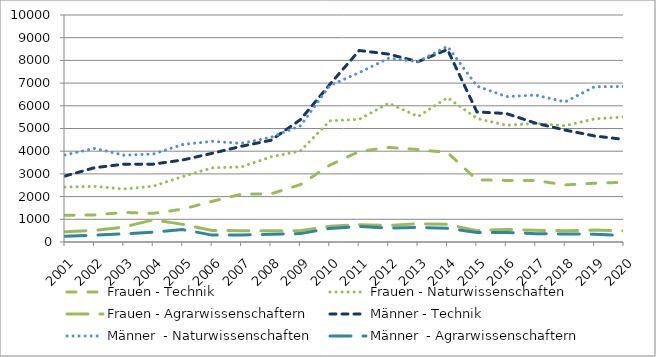
| Category | Frauen - Technik | Frauen - Naturwissenschaften | Frauen - Agrarwissenschaftern | Männer - Technik | Männer  - Naturwissenschaften | Männer  - Agrarwissenschaftern |
|---|---|---|---|---|---|---|
| 2001.0 | 1177 | 2421 | 455 | 2906 | 3835 | 250 |
| 2002.0 | 1193 | 2452 | 509 | 3271 | 4123 | 302 |
| 2003.0 | 1302 | 2335 | 658 | 3429 | 3827 | 359 |
| 2004.0 | 1263 | 2459 | 977 | 3430 | 3876 | 431 |
| 2005.0 | 1448 | 2883 | 777 | 3613 | 4295 | 550 |
| 2006.0 | 1793 | 3266 | 505 | 3906 | 4434 | 304 |
| 2007.0 | 2107 | 3308 | 500 | 4219 | 4348 | 309 |
| 2008.0 | 2120 | 3751 | 500 | 4482 | 4609 | 341 |
| 2009.0 | 2527 | 4009 | 499 | 5387 | 5117 | 369 |
| 2010.0 | 3385 | 5337 | 698 | 6940 | 6892 | 598 |
| 2011.0 | 3989 | 5404 | 764 | 8437 | 7461 | 685 |
| 2012.0 | 4166 | 6115 | 732 | 8277 | 8094 | 616 |
| 2013.0 | 4073 | 5529 | 802 | 7942 | 7949 | 641 |
| 2014.0 | 3940 | 6360 | 781 | 8481 | 8619 | 611 |
| 2015.0 | 2740 | 5445 | 498 | 5731 | 6870 | 417 |
| 2016.0 | 2713 | 5141 | 556 | 5659 | 6408 | 418 |
| 2017.0 | 2708 | 5226 | 514 | 5235 | 6472 | 367 |
| 2018.0 | 2514 | 5124 | 499 | 4929 | 6171 | 353 |
| 2019.0 | 2591 | 5424 | 526 | 4671 | 6841 | 341 |
| 2020.0 | 2629 | 5507 | 481 | 4518 | 6850 | 280 |